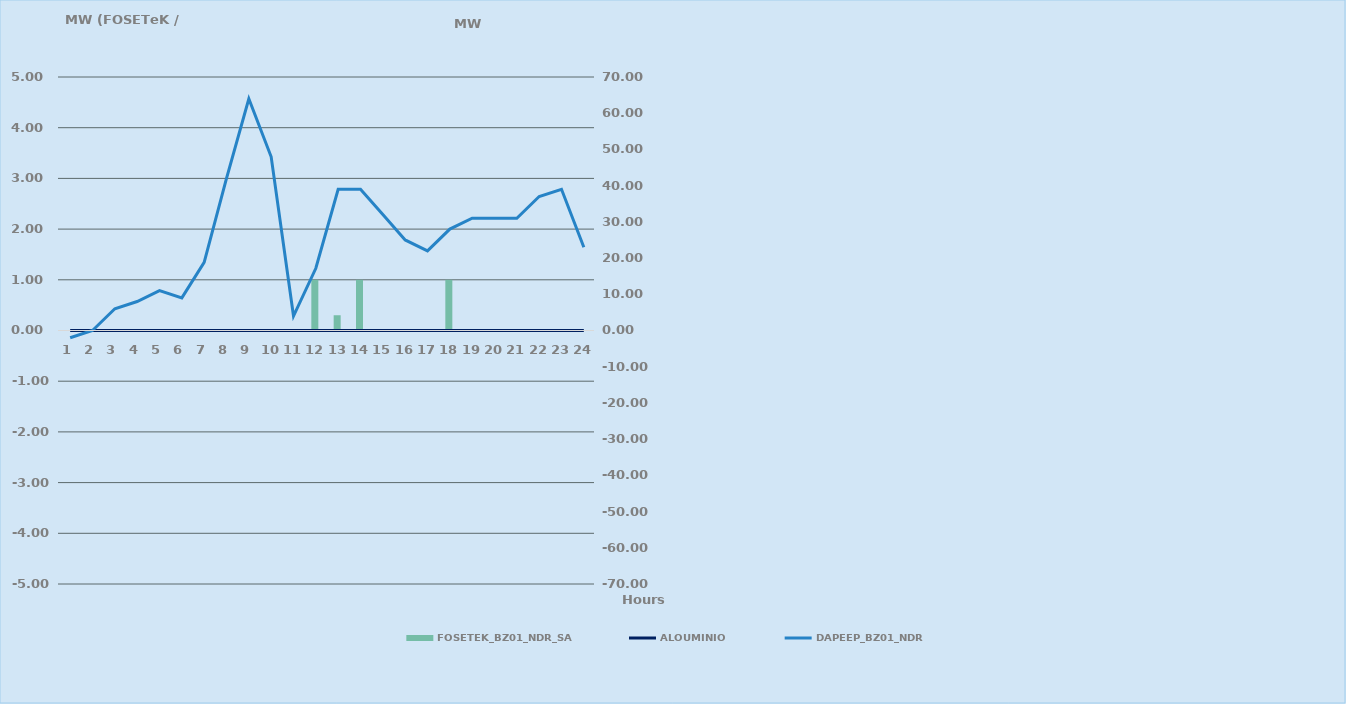
| Category | FOSETEK_BZ01_NDR_SA |
|---|---|
| 0 | 0 |
| 1 | 0 |
| 2 | 0 |
| 3 | 0 |
| 4 | 0 |
| 5 | 0 |
| 6 | 0 |
| 7 | 0 |
| 8 | 0 |
| 9 | 0 |
| 10 | 0 |
| 11 | 1 |
| 12 | 0.301 |
| 13 | 1 |
| 14 | 0 |
| 15 | 0 |
| 16 | 0 |
| 17 | 1 |
| 18 | 0 |
| 19 | 0 |
| 20 | 0 |
| 21 | 0 |
| 22 | 0 |
| 23 | 0 |